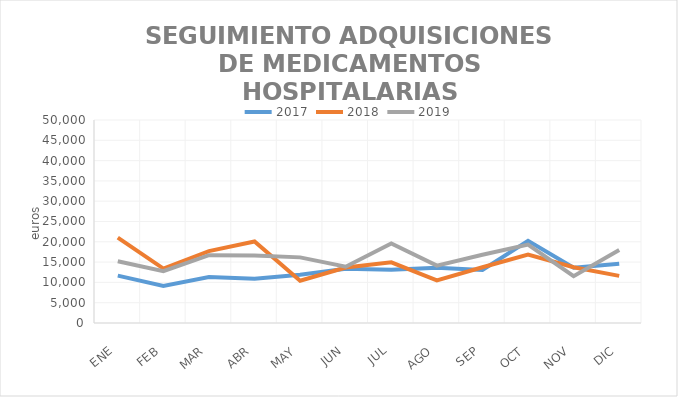
| Category | 2017 | 2018 | 2019 |
|---|---|---|---|
| ENE | 11671.31 | 21048 | 15227.07 |
| FEB | 9140.23 | 13413.46 | 12780.56 |
| MAR | 11303.7 | 17694.46 | 16709.26 |
| ABR | 10900.94 | 20069.34 | 16629.62 |
| MAY | 11863.34 | 10407.67 | 16165.71 |
| JUN | 13376.46 | 13678.19 | 13859.89 |
| JUL | 13090.24 | 14932.41 | 19577.9 |
| AGO | 13605.96 | 10516.18 | 14133.54 |
| SEP | 13043.89 | 13721.34 | 16821.85 |
| OCT | 20233.18 | 16838.16 | 19323.11 |
| NOV | 13604.97 | 13737.4 | 11527.9 |
| DIC | 14613.24 | 11601.41 | 17967.11 |